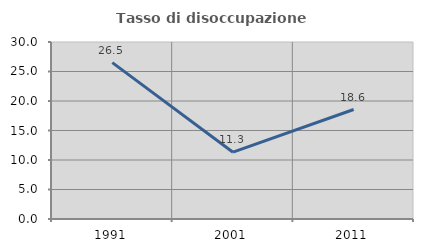
| Category | Tasso di disoccupazione giovanile  |
|---|---|
| 1991.0 | 26.512 |
| 2001.0 | 11.321 |
| 2011.0 | 18.557 |